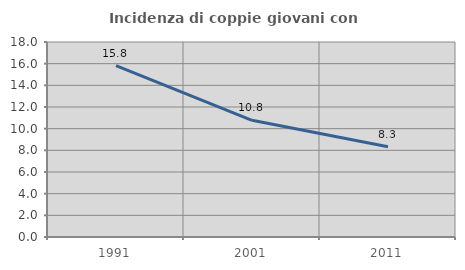
| Category | Incidenza di coppie giovani con figli |
|---|---|
| 1991.0 | 15.821 |
| 2001.0 | 10.771 |
| 2011.0 | 8.333 |